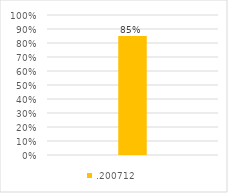
| Category | .200712 |
|---|---|
| 0 | 0.85 |